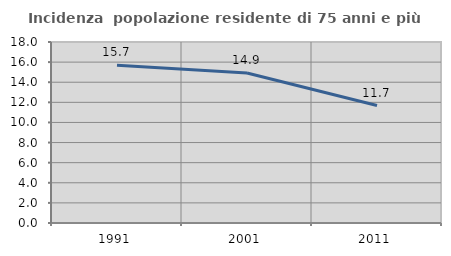
| Category | Incidenza  popolazione residente di 75 anni e più |
|---|---|
| 1991.0 | 15.686 |
| 2001.0 | 14.916 |
| 2011.0 | 11.681 |